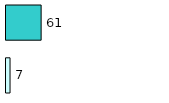
| Category | Series 0 | Series 1 |
|---|---|---|
| 0 | 7 | 61 |